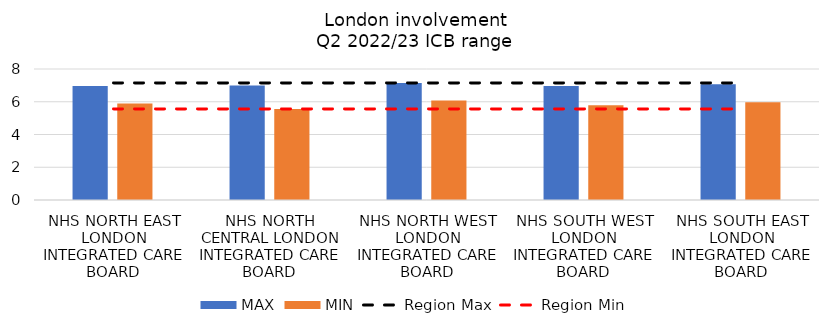
| Category | MAX | MIN |
|---|---|---|
| NHS NORTH EAST LONDON INTEGRATED CARE BOARD | 6.968 | 5.887 |
| NHS NORTH CENTRAL LONDON INTEGRATED CARE BOARD | 6.995 | 5.565 |
| NHS NORTH WEST LONDON INTEGRATED CARE BOARD | 7.151 | 6.071 |
| NHS SOUTH WEST LONDON INTEGRATED CARE BOARD | 6.964 | 5.793 |
| NHS SOUTH EAST LONDON INTEGRATED CARE BOARD | 7.064 | 5.97 |